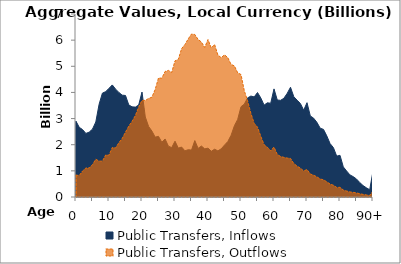
| Category | Public Transfers, Inflows | Public Transfers, Outflows |
|---|---|---|
| 0 | 2894.95 | 835.361 |
|  | 2664.44 | 822.598 |
| 2 | 2577.936 | 996.155 |
| 3 | 2431.888 | 1108.523 |
| 4 | 2481.292 | 1111.35 |
| 5 | 2598.093 | 1237.872 |
| 6 | 2870.363 | 1444.789 |
| 7 | 3546.693 | 1372.263 |
| 8 | 3973.235 | 1370.841 |
| 9 | 4030.524 | 1607.98 |
| 10 | 4158.44 | 1599.141 |
| 11 | 4286.617 | 1893.32 |
| 12 | 4127.004 | 1876.341 |
| 13 | 3998.109 | 2075.957 |
| 14 | 3896.089 | 2240.445 |
| 15 | 3883.098 | 2480.295 |
| 16 | 3519.942 | 2711.085 |
| 17 | 3449.254 | 2893.579 |
| 18 | 3438.747 | 3118.098 |
| 19 | 3519.429 | 3441.544 |
| 20 | 4014.91 | 3697.694 |
| 21 | 3061.319 | 3694.544 |
| 22 | 2698.695 | 3768.35 |
| 23 | 2522.914 | 3818.19 |
| 24 | 2289.336 | 4115.647 |
| 25 | 2319.608 | 4554.83 |
| 26 | 2093.672 | 4542.661 |
| 27 | 2218.313 | 4802.451 |
| 28 | 1943.965 | 4843.129 |
| 29 | 1890.187 | 4763.391 |
| 30 | 2134.681 | 5207.281 |
| 31 | 1869.946 | 5262.795 |
| 32 | 1911.227 | 5675.199 |
| 33 | 1766.78 | 5830.189 |
| 34 | 1808.048 | 6046.107 |
| 35 | 1795.386 | 6232.795 |
| 36 | 2157.864 | 6217.121 |
| 37 | 1858.763 | 6026.698 |
| 38 | 1949.043 | 5927.699 |
| 39 | 1843.134 | 5722.099 |
| 40 | 1868.075 | 6022.276 |
| 41 | 1750.26 | 5701.866 |
| 42 | 1827.506 | 5834.779 |
| 43 | 1765.449 | 5428.474 |
| 44 | 1842.711 | 5329.615 |
| 45 | 1985.857 | 5438.923 |
| 46 | 2120.727 | 5331.05 |
| 47 | 2361.768 | 5072.112 |
| 48 | 2724.908 | 5013.538 |
| 49 | 2968.933 | 4753.071 |
| 50 | 3453.492 | 4683.055 |
| 51 | 3552.827 | 4064.417 |
| 52 | 3791.449 | 3681.919 |
| 53 | 3861.536 | 3199.861 |
| 54 | 3829.235 | 2815.59 |
| 55 | 3996.534 | 2671.262 |
| 56 | 3787.533 | 2322.617 |
| 57 | 3514.896 | 1999.253 |
| 58 | 3603.953 | 1902.414 |
| 59 | 3585.333 | 1767.388 |
| 60 | 4134.832 | 1909.808 |
| 61 | 3708.646 | 1627.629 |
| 62 | 3698.024 | 1548.59 |
| 63 | 3777.391 | 1515.724 |
| 64 | 3963.227 | 1488.218 |
| 65 | 4197.72 | 1476.205 |
| 66 | 3835.306 | 1280.12 |
| 67 | 3705.281 | 1180.551 |
| 68 | 3576.493 | 1103.025 |
| 69 | 3319.694 | 994.615 |
| 70 | 3608.171 | 1051.206 |
| 71 | 3101.353 | 879.87 |
| 72 | 3015.71 | 832.403 |
| 73 | 2856.706 | 771.028 |
| 74 | 2632.496 | 688.268 |
| 75 | 2586.095 | 657.421 |
| 76 | 2336.156 | 579.325 |
| 77 | 2041.829 | 494.42 |
| 78 | 1890.412 | 449.396 |
| 79 | 1563.787 | 366.31 |
| 80 | 1594.799 | 370.453 |
| 81 | 1152.048 | 265.675 |
| 82 | 995.568 | 228.933 |
| 83 | 847.2 | 194.223 |
| 84 | 778.972 | 178.016 |
| 85 | 687.683 | 156.764 |
| 86 | 551.168 | 125.531 |
| 87 | 437.156 | 99.28 |
| 88 | 351.884 | 79.623 |
| 89 | 277.826 | 62.368 |
| 90+ | 985.447 | 221.114 |